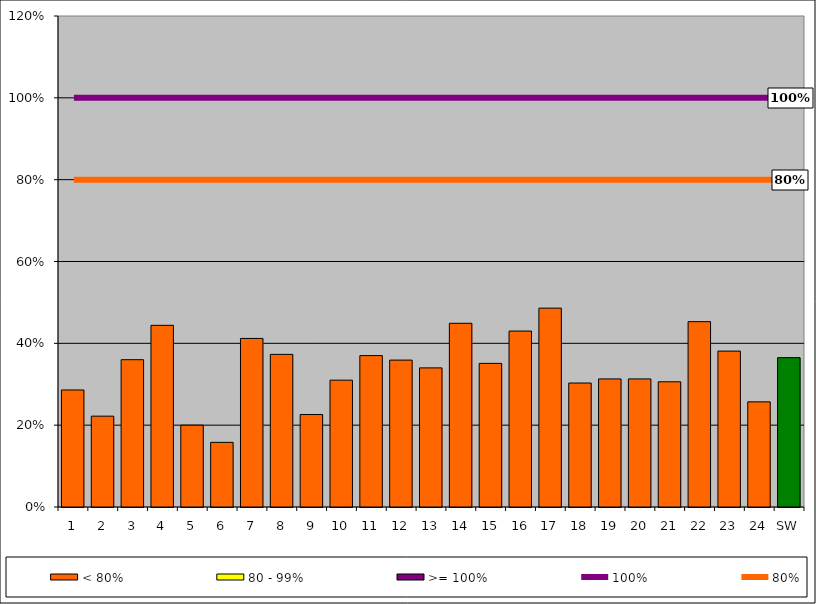
| Category | < 80% | 80 - 99% | >= 100% |
|---|---|---|---|
| 1 | 0.286 | 0 | 0 |
| 2 | 0.222 | 0 | 0 |
| 3 | 0.36 | 0 | 0 |
| 4 | 0.444 | 0 | 0 |
| 5 | 0.2 | 0 | 0 |
| 6 | 0.158 | 0 | 0 |
| 7 | 0.412 | 0 | 0 |
| 8 | 0.373 | 0 | 0 |
| 9 | 0.226 | 0 | 0 |
| 10 | 0.31 | 0 | 0 |
| 11 | 0.37 | 0 | 0 |
| 12 | 0.359 | 0 | 0 |
| 13 | 0.34 | 0 | 0 |
| 14 | 0.449 | 0 | 0 |
| 15 | 0.351 | 0 | 0 |
| 16 | 0.43 | 0 | 0 |
| 17 | 0.486 | 0 | 0 |
| 18 | 0.303 | 0 | 0 |
| 19 | 0.313 | 0 | 0 |
| 20 | 0.313 | 0 | 0 |
| 21 | 0.306 | 0 | 0 |
| 22 | 0.453 | 0 | 0 |
| 23 | 0.381 | 0 | 0 |
| 24 | 0.257 | 0 | 0 |
| SW | 0.365 | 0 | 0 |